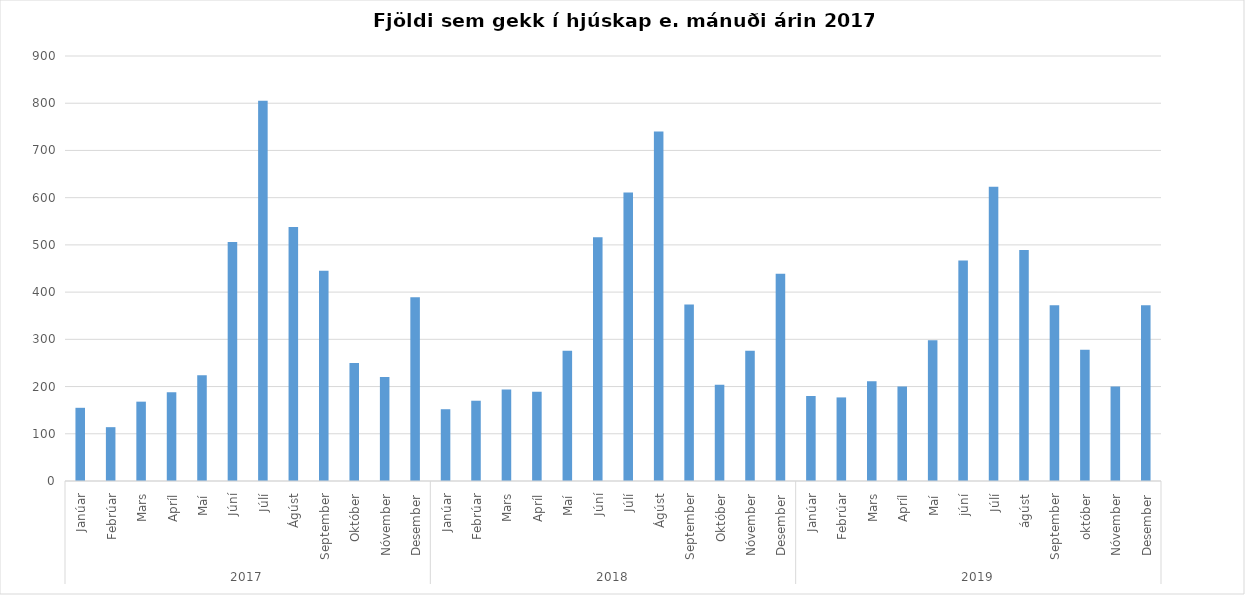
| Category | Series 0 |
|---|---|
| 0 | 155 |
| 1 | 114 |
| 2 | 168 |
| 3 | 188 |
| 4 | 224 |
| 5 | 506 |
| 6 | 805 |
| 7 | 538 |
| 8 | 445 |
| 9 | 250 |
| 10 | 220 |
| 11 | 389 |
| 12 | 152 |
| 13 | 170 |
| 14 | 194 |
| 15 | 189 |
| 16 | 276 |
| 17 | 516 |
| 18 | 611 |
| 19 | 740 |
| 20 | 374 |
| 21 | 204 |
| 22 | 276 |
| 23 | 439 |
| 24 | 180 |
| 25 | 177 |
| 26 | 211 |
| 27 | 200 |
| 28 | 298 |
| 29 | 467 |
| 30 | 623 |
| 31 | 489 |
| 32 | 372 |
| 33 | 278 |
| 34 | 200 |
| 35 | 372 |